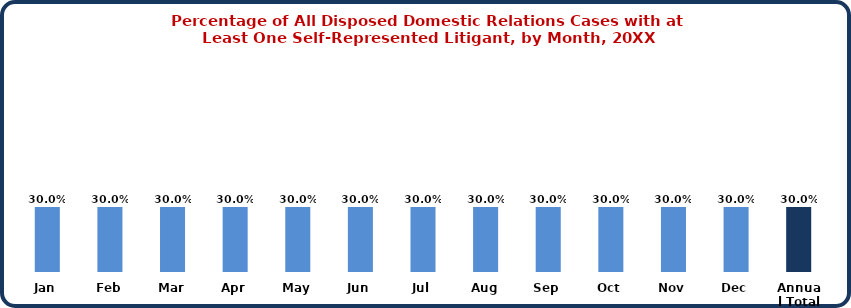
| Category | Domestic Relations |
|---|---|
| Jan | 0.3 |
| Feb | 0.3 |
| Mar | 0.3 |
| Apr | 0.3 |
| May | 0.3 |
| Jun | 0.3 |
| Jul | 0.3 |
| Aug | 0.3 |
| Sep | 0.3 |
| Oct | 0.3 |
| Nov | 0.3 |
| Dec | 0.3 |
| Annual Total | 0.3 |